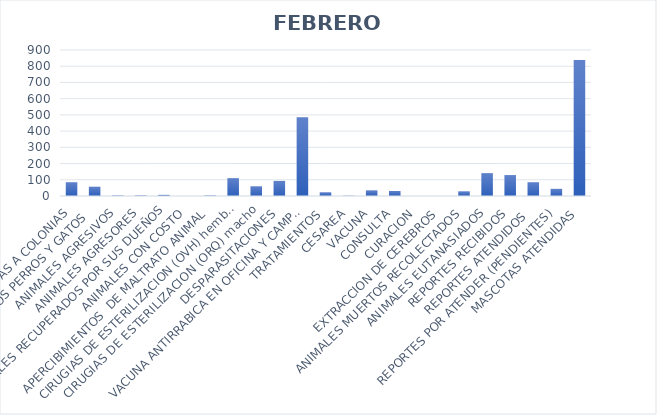
| Category | Series 0 |
|---|---|
| VISITAS A COLONIAS | 85 |
| ANIMALES CAPTURADOS PERROS Y GATOS  | 57 |
| ANIMALES AGRESIVOS | 3 |
| ANIMALES AGRESORES | 4 |
| ANIMALES RECUPERADOS POR SUS DUEÑOS | 7 |
| ANIMALES CON COSTO | 0 |
| APERCIBIMIENTOS  DE MALTRATO ANIMAL | 3 |
| CIRUGIAS DE ESTERILIZACION (OVH) hembra | 110 |
| CIRUGIAS DE ESTERILIZACION (ORQ) macho | 60 |
| DESPARASITACIONES | 93 |
| VACUNA ANTIRRABICA EN OFICINA Y CAMPAÑAS  | 485 |
| TRATAMIENTOS | 23 |
| CESAREA | 2 |
| VACUNA | 35 |
| CONSULTA | 31 |
| CURACION | 0 |
| EXTRACCION DE CEREBROS | 0 |
| ANIMALES MUERTOS RECOLECTADOS | 29 |
| ANIMALES EUTANASIADOS | 141 |
| REPORTES RECIBIDOS | 129 |
| REPORTES ATENDIDOS  | 85 |
| REPORTES POR ATENDER (PENDIENTES) | 44 |
| MASCOTAS ATENDIDAS | 839 |